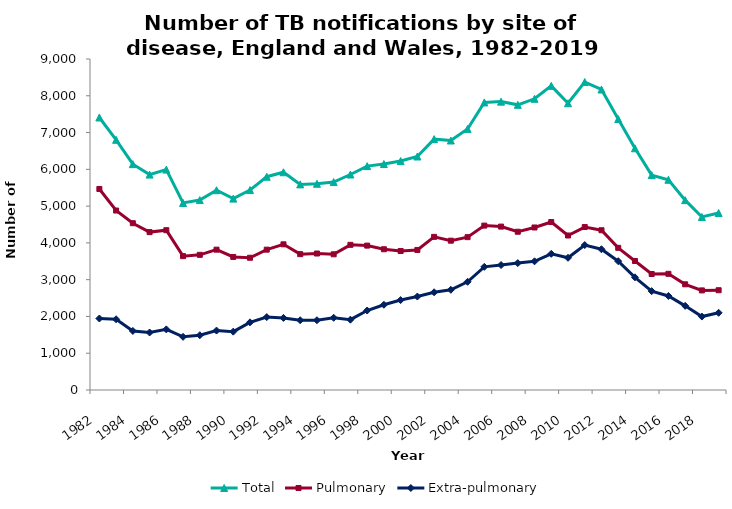
| Category | Total | Pulmonary | Extra-pulmonary |
|---|---|---|---|
| 1982.0 | 7410 | 5466 | 1944 |
| 1983.0 | 6803 | 4880 | 1923 |
| 1984.0 | 6141 | 4535 | 1606 |
| 1985.0 | 5857 | 4293 | 1564 |
| 1986.0 | 5993 | 4345 | 1648 |
| 1987.0 | 5086 | 3640 | 1446 |
| 1988.0 | 5164 | 3675 | 1489 |
| 1989.0 | 5432 | 3816 | 1616 |
| 1990.0 | 5204 | 3618 | 1586 |
| 1991.0 | 5436 | 3596 | 1840 |
| 1992.0 | 5799 | 3816 | 1983 |
| 1993.0 | 5921 | 3961 | 1960 |
| 1994.0 | 5591 | 3694 | 1897 |
| 1995.0 | 5608 | 3711 | 1897 |
| 1996.0 | 5654 | 3690 | 1964 |
| 1997.0 | 5859 | 3947 | 1912 |
| 1998.0 | 6087 | 3926 | 2161 |
| 1999.0 | 6144 | 3827 | 2317 |
| 2000.0 | 6225 | 3780 | 2445 |
| 2001.0 | 6349 | 3808 | 2541 |
| 2002.0 | 6821 | 4164 | 2657 |
| 2003.0 | 6784 | 4060 | 2724 |
| 2004.0 | 7098 | 4156 | 2942 |
| 2005.0 | 7819 | 4470 | 3349 |
| 2006.0 | 7841 | 4443 | 3398 |
| 2007.0 | 7754 | 4303 | 3451 |
| 2008.0 | 7918 | 4419 | 3499 |
| 2009.0 | 8270 | 4567 | 3703 |
| 2010.0 | 7796 | 4201 | 3595 |
| 2011.0 | 8373 | 4431 | 3942 |
| 2012.0 | 8171 | 4344 | 3827 |
| 2013.0 | 7368 | 3866 | 3502 |
| 2014.0 | 6572 | 3508 | 3064 |
| 2015.0 | 5842 | 3154 | 2688 |
| 2016.0 | 5716 | 3159 | 2557 |
| 2017.0 | 5162 | 2874 | 2288 |
| 2018.0 | 4705 | 2708 | 1997 |
| 2019.0 | 4812 | 2713 | 2099 |